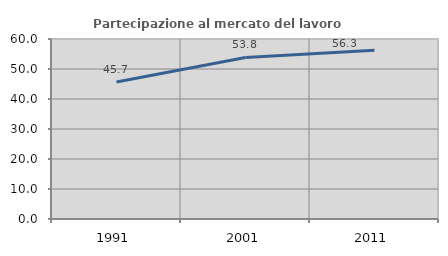
| Category | Partecipazione al mercato del lavoro  femminile |
|---|---|
| 1991.0 | 45.652 |
| 2001.0 | 53.846 |
| 2011.0 | 56.25 |